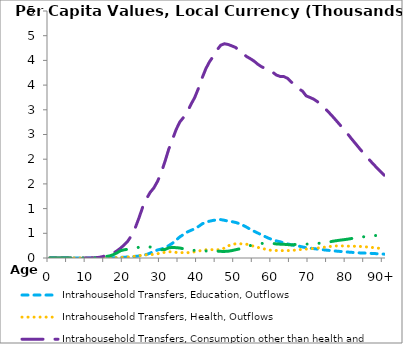
| Category | Intrahousehold Transfers, Education, Outflows | Intrahousehold Transfers, Health, Outflows | Intrahousehold Transfers, Consumption other than health and education, Outflows | Intrahousehold Transfers, Saving, Outflows |
|---|---|---|---|---|
| 0 | 0 | 0 | 0 | 0 |
|  | 0 | 0 | 0 | 0 |
| 2 | 0 | 0 | 0 | 0 |
| 3 | 0 | 0 | 0 | 0 |
| 4 | 0 | 0 | 0 | 0 |
| 5 | 0 | 0 | 0 | 0 |
| 6 | 0 | 0 | 0 | 0 |
| 7 | 0 | 0 | 0 | 0 |
| 8 | 0.013 | 0 | 0.078 | 0.193 |
| 9 | 0.066 | 0.001 | 0.578 | 0.988 |
| 10 | 0.085 | 0.009 | 1.127 | 1.478 |
| 11 | 0.078 | 0.061 | 1.824 | 1.683 |
| 12 | 0.12 | 0.272 | 5.644 | 2.792 |
| 13 | 0.619 | 0.441 | 10.446 | 7.343 |
| 14 | 2.157 | 0.801 | 24.644 | 14.822 |
| 15 | 3.237 | 1.996 | 47.83 | 29.233 |
| 16 | 3.476 | 3.261 | 70.32 | 40.537 |
| 17 | 3.848 | 4.404 | 96.487 | 65.53 |
| 18 | 9.272 | 6.822 | 140.631 | 100.507 |
| 19 | 13.298 | 9.814 | 198.003 | 146.999 |
| 20 | 17.058 | 13.812 | 264.25 | 165.679 |
| 21 | 18.385 | 17.859 | 342.646 | 177.891 |
| 22 | 23.95 | 25.822 | 457.038 | 188.745 |
| 23 | 32.82 | 36.415 | 612.508 | 197.11 |
| 24 | 40.624 | 46.477 | 812.794 | 218.926 |
| 25 | 53.586 | 57.978 | 1031.731 | 231.541 |
| 26 | 70.306 | 66.064 | 1194.386 | 234.237 |
| 27 | 98.511 | 70.614 | 1328.476 | 222.472 |
| 28 | 134.958 | 71.504 | 1418.803 | 196.619 |
| 29 | 162.71 | 85.517 | 1553.499 | 178.43 |
| 30 | 181.099 | 105.842 | 1731.002 | 167.916 |
| 31 | 210.406 | 115.243 | 1954.8 | 173.186 |
| 32 | 249.927 | 125.931 | 2200.731 | 204.613 |
| 33 | 298.96 | 124.916 | 2398.769 | 215.367 |
| 34 | 362.753 | 113.498 | 2600.764 | 208.801 |
| 35 | 428.265 | 111.152 | 2754.917 | 202.354 |
| 36 | 476.169 | 107.22 | 2847.28 | 184.886 |
| 37 | 525.919 | 106.967 | 2957.453 | 160.331 |
| 38 | 560.315 | 114.097 | 3111.26 | 154.171 |
| 39 | 591.313 | 125.618 | 3248.086 | 154.663 |
| 40 | 636.789 | 140.667 | 3434.069 | 155.427 |
| 41 | 690.526 | 154.919 | 3645.507 | 150.319 |
| 42 | 726.216 | 166.326 | 3832.505 | 142.142 |
| 43 | 745.503 | 170.717 | 3974.774 | 141.44 |
| 44 | 760.986 | 167.324 | 4082.607 | 143.587 |
| 45 | 773.276 | 165.913 | 4209.764 | 139.587 |
| 46 | 777.421 | 170.584 | 4307.027 | 134.404 |
| 47 | 763.409 | 200.802 | 4336.671 | 132.944 |
| 48 | 745.448 | 245.471 | 4322.189 | 137.833 |
| 49 | 736.331 | 272.234 | 4293.27 | 150.291 |
| 50 | 720.029 | 287.746 | 4262.516 | 167.137 |
| 51 | 695.87 | 288.868 | 4193.717 | 183.593 |
| 52 | 662.688 | 284.332 | 4133.654 | 206.022 |
| 53 | 622.824 | 277.574 | 4076.555 | 230.619 |
| 54 | 579.547 | 257.204 | 4034.087 | 252.721 |
| 55 | 540.281 | 235.336 | 3984.211 | 267.996 |
| 56 | 505.187 | 214.769 | 3921.4 | 280.92 |
| 57 | 466.877 | 194.591 | 3871.012 | 294.235 |
| 58 | 431.938 | 178.662 | 3837.727 | 300.827 |
| 59 | 397.357 | 159.931 | 3797.316 | 302.423 |
| 60 | 369.874 | 155.184 | 3759.756 | 295.444 |
| 61 | 345.725 | 151.765 | 3703.257 | 284.502 |
| 62 | 328.025 | 150.627 | 3675.767 | 280.248 |
| 63 | 306.049 | 148.493 | 3672.905 | 277.322 |
| 64 | 284.545 | 149.892 | 3635.76 | 271.505 |
| 65 | 267.631 | 151.983 | 3563.521 | 264.761 |
| 66 | 249.109 | 159.946 | 3497.098 | 272.618 |
| 67 | 241.319 | 167.384 | 3424.094 | 280.641 |
| 68 | 224.259 | 174.571 | 3379.613 | 282.2 |
| 69 | 209.555 | 180.143 | 3282.456 | 281.021 |
| 70 | 198.859 | 186.505 | 3250.485 | 282.309 |
| 71 | 190.291 | 193.653 | 3217.006 | 287.409 |
| 72 | 180.915 | 201.055 | 3167.444 | 293.922 |
| 73 | 171.183 | 209.329 | 3097.368 | 301.625 |
| 74 | 162.944 | 218.941 | 3032.041 | 310.486 |
| 75 | 155.038 | 228.776 | 2956.572 | 321.497 |
| 76 | 146.914 | 238.835 | 2875.646 | 336.138 |
| 77 | 140.325 | 244.134 | 2791.017 | 348.885 |
| 78 | 134.049 | 246.121 | 2704.167 | 359.895 |
| 79 | 127.776 | 243.556 | 2618.731 | 369.196 |
| 80 | 121.156 | 240.301 | 2531.51 | 379.313 |
| 81 | 116.213 | 240.435 | 2433.299 | 391.767 |
| 82 | 110.634 | 237.836 | 2342.185 | 402.97 |
| 83 | 105.47 | 235.308 | 2250.931 | 414.153 |
| 84 | 100.71 | 232.435 | 2160.623 | 425.016 |
| 85 | 99.008 | 225.784 | 2072.644 | 433.245 |
| 86 | 95.572 | 218.605 | 1989.367 | 441.608 |
| 87 | 91.496 | 211.297 | 1907.752 | 449.376 |
| 88 | 87.225 | 203.003 | 1828.483 | 456.271 |
| 89 | 82.696 | 193.727 | 1751.412 | 462.433 |
| 90+ | 77.873 | 183.493 | 1676.037 | 468.065 |